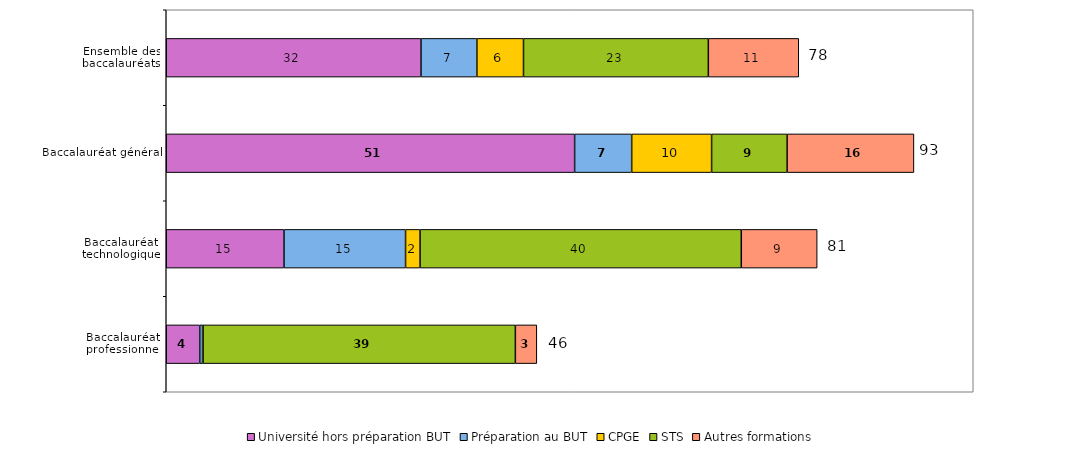
| Category | Université hors préparation BUT | Préparation au BUT | CPGE | STS | Autres formations |
|---|---|---|---|---|---|
| Ensemble des baccalauréats | 31.566 | 6.929 | 5.774 | 22.905 | 11.207 |
| Baccalauréat général | 50.606 | 7.071 | 9.9 | 9.356 | 15.715 |
| Baccalauréat technologique | 14.589 | 15.064 | 1.799 | 39.805 | 9.402 |
| Baccalauréat professionnel | 4.15 | 0.354 | 0.06 | 38.698 | 2.658 |